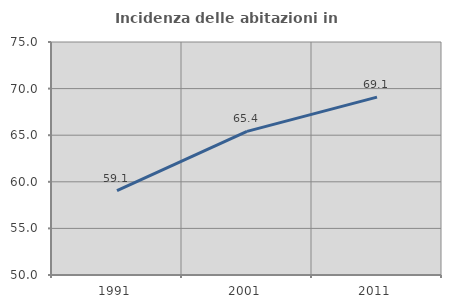
| Category | Incidenza delle abitazioni in proprietà  |
|---|---|
| 1991.0 | 59.06 |
| 2001.0 | 65.412 |
| 2011.0 | 69.081 |